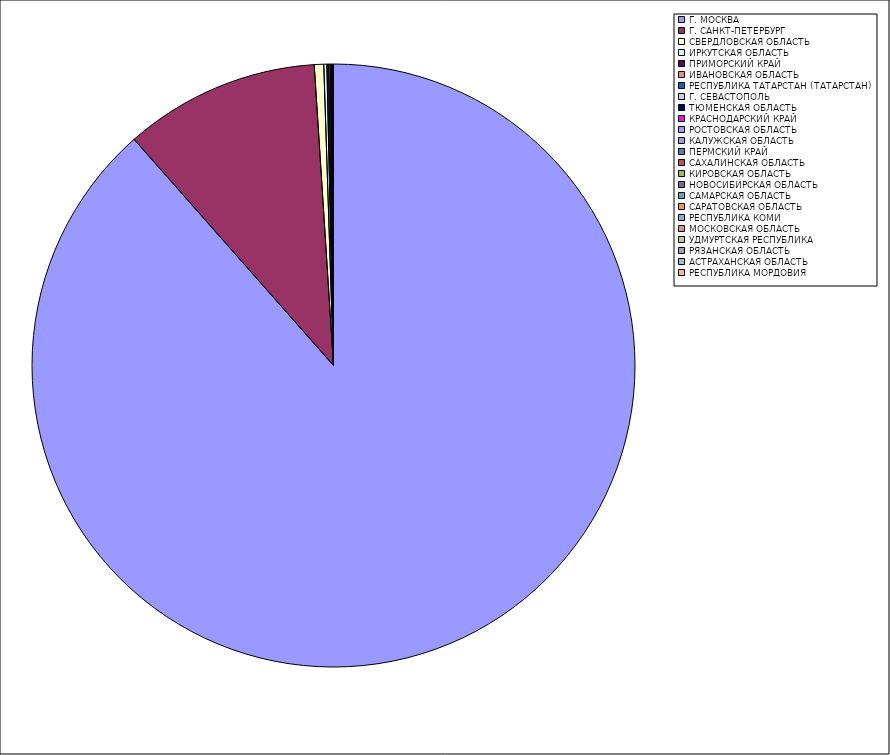
| Category | Оборот |
|---|---|
| Г. МОСКВА | 88.487 |
| Г. САНКТ-ПЕТЕРБУРГ | 10.481 |
| СВЕРДЛОВСКАЯ ОБЛАСТЬ | 0.504 |
| ИРКУТСКАЯ ОБЛАСТЬ | 0.164 |
| ПРИМОРСКИЙ КРАЙ | 0.101 |
| ИВАНОВСКАЯ ОБЛАСТЬ | 0.078 |
| РЕСПУБЛИКА ТАТАРСТАН (ТАТАРСТАН) | 0.032 |
| Г. СЕВАСТОПОЛЬ | 0.029 |
| ТЮМЕНСКАЯ ОБЛАСТЬ | 0.027 |
| КРАСНОДАРСКИЙ КРАЙ | 0.024 |
| РОСТОВСКАЯ ОБЛАСТЬ | 0.011 |
| КАЛУЖСКАЯ ОБЛАСТЬ | 0.008 |
| ПЕРМСКИЙ КРАЙ | 0.008 |
| САХАЛИНСКАЯ ОБЛАСТЬ | 0.005 |
| КИРОВСКАЯ ОБЛАСТЬ | 0.004 |
| НОВОСИБИРСКАЯ ОБЛАСТЬ | 0.004 |
| САМАРСКАЯ ОБЛАСТЬ | 0.004 |
| САРАТОВСКАЯ ОБЛАСТЬ | 0.003 |
| РЕСПУБЛИКА КОМИ | 0.003 |
| МОСКОВСКАЯ ОБЛАСТЬ | 0.003 |
| УДМУРТСКАЯ РЕСПУБЛИКА | 0.002 |
| РЯЗАНСКАЯ ОБЛАСТЬ | 0.002 |
| АСТРАХАНСКАЯ ОБЛАСТЬ | 0.002 |
| РЕСПУБЛИКА МОРДОВИЯ | 0.002 |